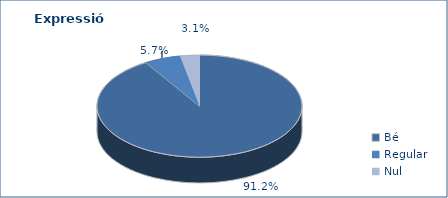
| Category | Series 0 |
|---|---|
| Bé | 5242 |
| Regular | 329 |
| Nul | 176 |